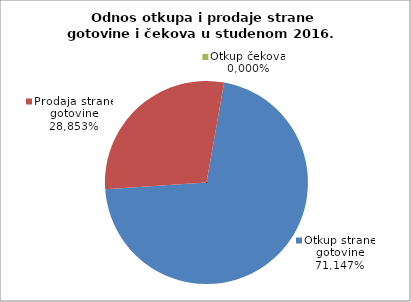
| Category | Otkup strane gotovine |
|---|---|
| 0 | 0.711 |
| 1 | 0.289 |
| 2 | 0 |